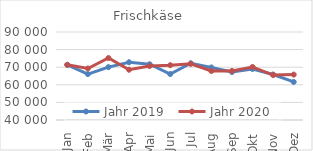
| Category | Jahr 2019 | Jahr 2020 |
|---|---|---|
| Jan | 71331.39 | 71357.636 |
| Feb | 66085.73 | 69273.118 |
| Mär | 70026.971 | 75222.138 |
| Apr | 72823.555 | 68553.002 |
| Mai | 71685.836 | 70672.803 |
| Jun | 66111.212 | 71133.125 |
| Jul | 72256.739 | 71902.047 |
| Aug | 69864.079 | 67851.217 |
| Sep | 67261.39 | 67876.475 |
| Okt | 68996.678 | 70132.794 |
| Nov | 65862.787 | 65522.364 |
| Dez | 61623.478 | 65798.82 |